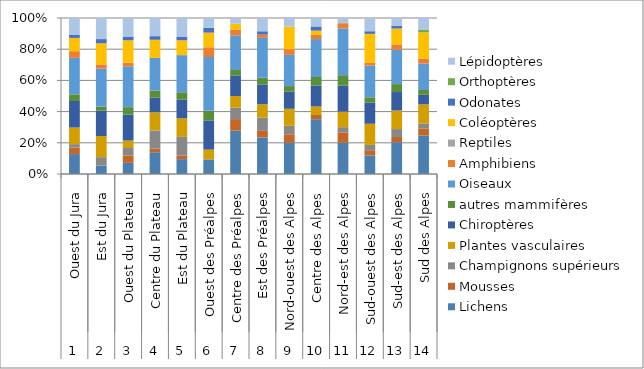
| Category | Lichens | Mousses | Champignons supérieurs | Plantes vasculaires | Chiroptères | autres mammifères | Oiseaux | Amphibiens | Reptiles | Coléoptères | Odonates | Orthoptères | Lépidoptères |
|---|---|---|---|---|---|---|---|---|---|---|---|---|---|
| 0 | 6 | 2 | 1 | 5 | 8 | 2 | 11 | 2 | 0 | 4 | 1 | 0 | 5 |
| 1 | 2 | 0 | 2 | 5 | 6 | 1 | 9 | 1 | 0 | 5 | 1 | 0 | 5 |
| 2 | 3 | 2 | 2 | 2 | 7 | 2 | 11 | 1 | 0 | 6 | 1 | 0 | 5 |
| 3 | 6 | 1 | 5 | 5 | 4 | 2 | 9 | 0 | 0 | 5 | 1 | 0 | 5 |
| 4 | 4 | 1 | 5 | 5 | 5 | 2 | 10 | 0 | 0 | 4 | 1 | 0 | 5 |
| 5 | 3 | 0 | 0 | 2 | 6 | 2 | 11 | 2 | 0 | 3 | 1 | 0 | 2 |
| 6 | 15 | 4 | 4 | 4 | 7 | 2 | 12 | 2 | 0 | 2 | 0 | 0 | 2 |
| 7 | 11 | 2 | 4 | 4 | 6 | 2 | 12 | 1 | 0 | 0 | 1 | 0 | 4 |
| 8 | 11 | 3 | 3 | 6 | 6 | 2 | 11 | 2 | 0 | 8 | 0 | 0 | 3 |
| 9 | 13 | 1 | 0 | 2 | 5 | 2 | 9 | 1 | 0 | 1 | 1 | 0 | 2 |
| 10 | 6 | 2 | 1 | 3 | 5 | 2 | 9 | 1 | 0 | 0 | 0 | 0 | 1 |
| 11 | 7 | 2 | 2 | 8 | 8 | 2 | 12 | 1 | 0 | 11 | 1 | 0 | 5 |
| 12 | 12 | 2 | 3 | 7 | 7 | 3 | 13 | 2 | 0 | 6 | 1 | 0 | 3 |
| 13 | 16 | 3 | 2 | 8 | 4 | 2 | 11 | 2 | 0 | 11 | 0 | 1 | 5 |